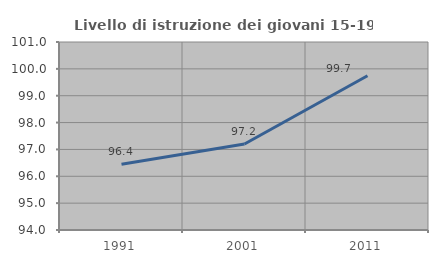
| Category | Livello di istruzione dei giovani 15-19 anni |
|---|---|
| 1991.0 | 96.444 |
| 2001.0 | 97.203 |
| 2011.0 | 99.745 |